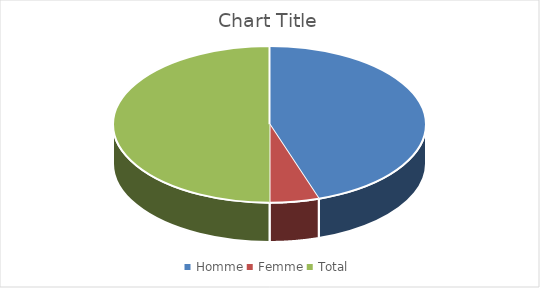
| Category | Series 0 |
|---|---|
| Homme | 185 |
| Femme | 21 |
| Total | 206 |